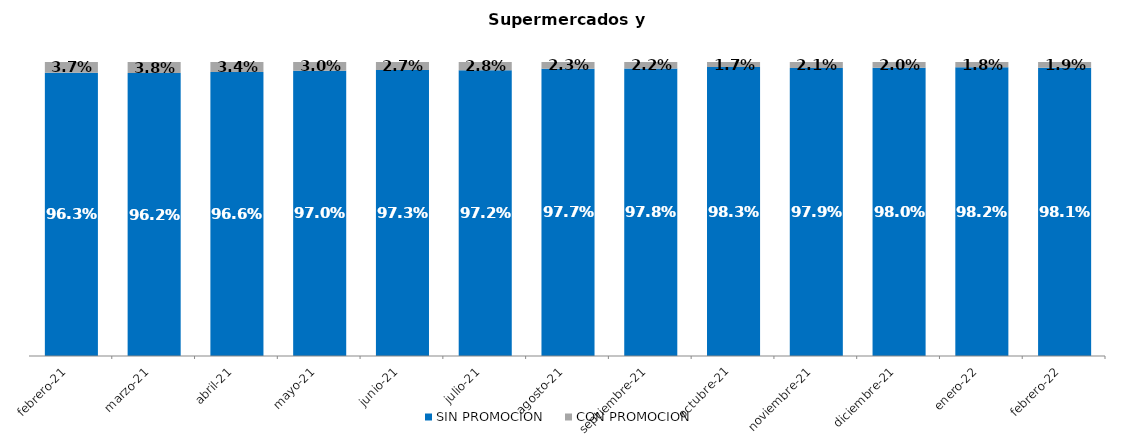
| Category | SIN PROMOCION   | CON PROMOCION   |
|---|---|---|
| 2021-02-01 | 0.963 | 0.037 |
| 2021-03-01 | 0.962 | 0.038 |
| 2021-04-01 | 0.966 | 0.034 |
| 2021-05-01 | 0.97 | 0.03 |
| 2021-06-01 | 0.973 | 0.027 |
| 2021-07-01 | 0.972 | 0.028 |
| 2021-08-01 | 0.977 | 0.023 |
| 2021-09-01 | 0.978 | 0.022 |
| 2021-10-01 | 0.983 | 0.017 |
| 2021-11-01 | 0.979 | 0.021 |
| 2021-12-01 | 0.98 | 0.02 |
| 2022-01-01 | 0.982 | 0.018 |
| 2022-02-01 | 0.981 | 0.019 |